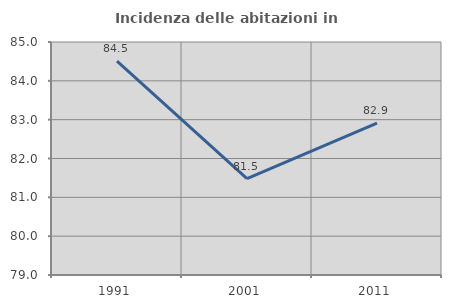
| Category | Incidenza delle abitazioni in proprietà  |
|---|---|
| 1991.0 | 84.507 |
| 2001.0 | 81.481 |
| 2011.0 | 82.911 |